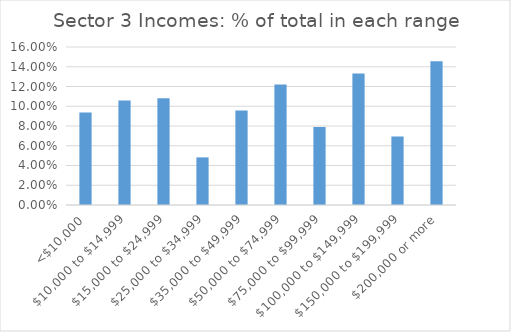
| Category | Series 0 |
|---|---|
| <$10,000 | 0.094 |
| $10,000 to $14,999 | 0.106 |
| $15,000 to $24,999 | 0.108 |
| $25,000 to $34,999 | 0.048 |
| $35,000 to $49,999 | 0.096 |
| $50,000 to $74,999 | 0.122 |
| $75,000 to $99,999 | 0.079 |
| $100,000 to $149,999 | 0.133 |
| $150,000 to $199,999 | 0.069 |
| $200,000 or more | 0.146 |